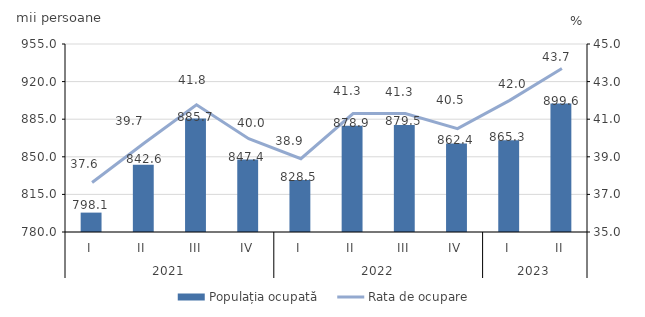
| Category | Populația ocupată |
|---|---|
| 0 | 798.054 |
| 1 | 842.611 |
| 2 | 885.715 |
| 3 | 847.401 |
| 4 | 828.5 |
| 5 | 878.9 |
| 6 | 879.5 |
| 7 | 862.4 |
| 8 | 865.3 |
| 9 | 899.6 |